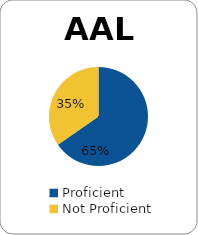
| Category | Series 0 |
|---|---|
| Proficient | 0.653 |
| Not Proficient | 0.347 |